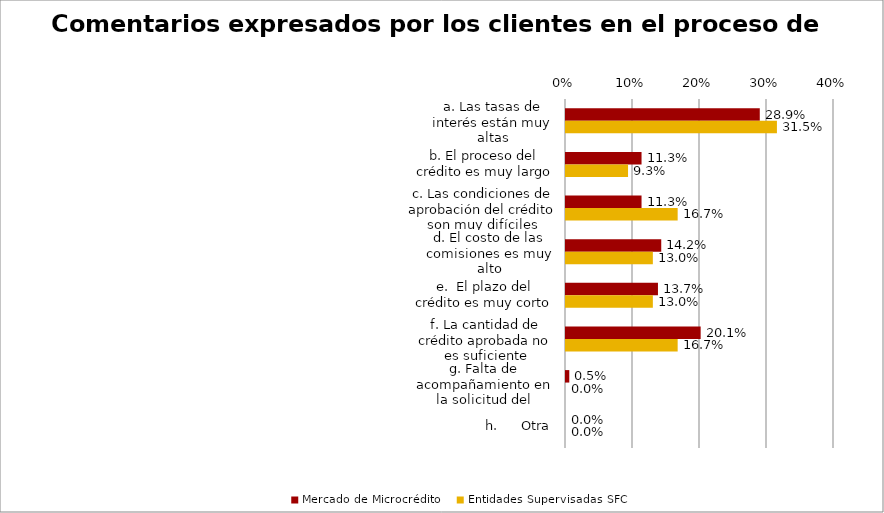
| Category | Mercado de Microcrédito | Entidades Supervisadas SFC |
|---|---|---|
| a. Las tasas de interés están muy altas | 0.289 | 0.315 |
| b. El proceso del crédito es muy largo | 0.113 | 0.093 |
| c. Las condiciones de aprobación del crédito son muy difíciles | 0.113 | 0.167 |
| d. El costo de las comisiones es muy alto | 0.142 | 0.13 |
| e.  El plazo del crédito es muy corto | 0.137 | 0.13 |
| f. La cantidad de crédito aprobada no es suficiente | 0.201 | 0.167 |
| g. Falta de acompañamiento en la solicitud del crédito | 0.005 | 0 |
| h.      Otra | 0 | 0 |